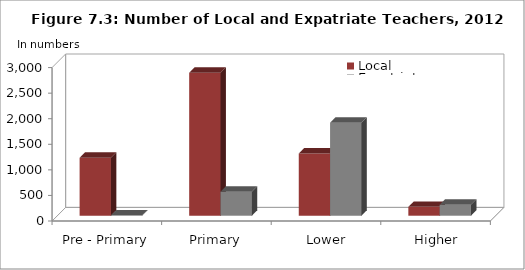
| Category | Local | Expatriate |
|---|---|---|
| Pre - Primary | 1135 | 7 |
| Primary | 2795 | 470 |
| Lower Secondary | 1217 | 1818 |
| Higher Secondary  | 174 | 214 |